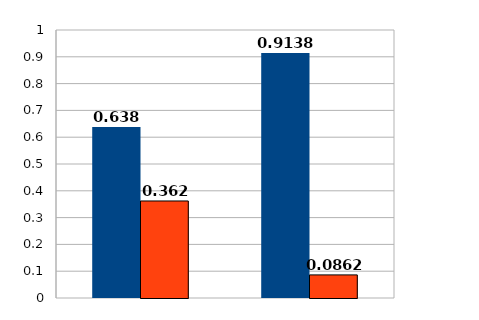
| Category | Series 0 | Series 1 |
|---|---|---|
| 0 | 0.638 | 0.362 |
| 1 | 0.914 | 0.086 |